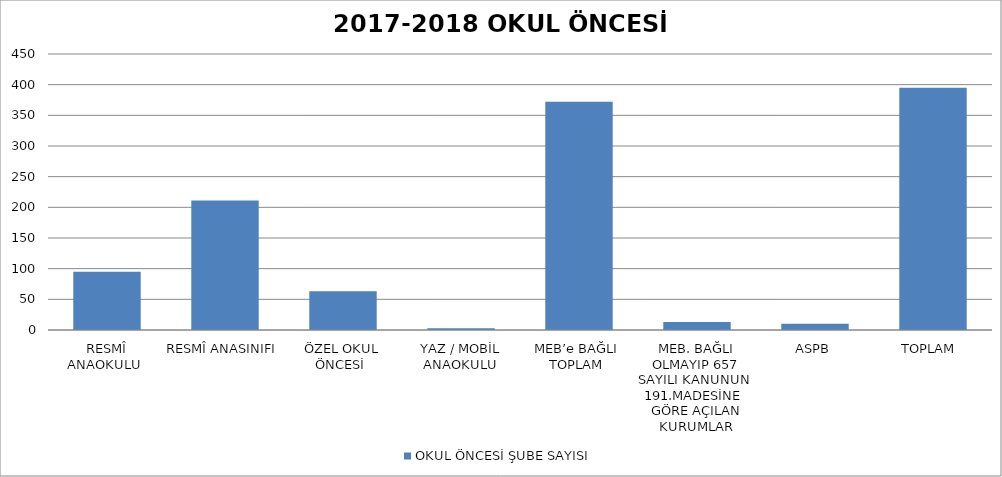
| Category | OKUL ÖNCESİ ŞUBE SAYISI |
|---|---|
| RESMÎ ANAOKULU  | 95 |
| RESMÎ ANASINIFI  | 211 |
| ÖZEL OKUL ÖNCESİ  | 63 |
| YAZ / MOBİL ANAOKULU | 3 |
| MEB’e BAĞLI  TOPLAM  | 372 |
| MEB. BAĞLI OLMAYIP 657 SAYILI KANUNUN  191.MADESİNE  GÖRE AÇILAN KURUMLAR | 13 |
| ASPB | 10 |
| TOPLAM  | 395 |